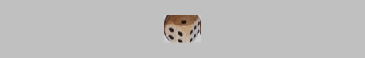
| Category | 1 | 2 | 3 | 4 | 5 | 6 |
|---|---|---|---|---|---|---|
|  | 0 | 0 | 0 | 0 | 0 | 0 |
|  | 0 | 0 | 0 | 0 | 0 | 0 |
|  | 0 | 0 | 0 | 0 | 0 | 0 |
| 2 | 0 | 1 | 0 | 0 | 0 | 0 |